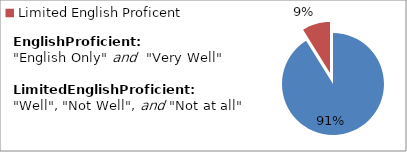
| Category | Percent |
|---|---|
| English Proficient | 0.912 |
| Limited English Proficent | 0.088 |